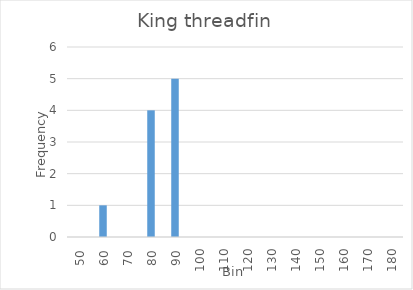
| Category | Frequency |
|---|---|
| 50.0 | 0 |
| 60.0 | 1 |
| 70.0 | 0 |
| 80.0 | 4 |
| 90.0 | 5 |
| 100.0 | 0 |
| 110.0 | 0 |
| 120.0 | 0 |
| 130.0 | 0 |
| 140.0 | 0 |
| 150.0 | 0 |
| 160.0 | 0 |
| 170.0 | 0 |
| 180.0 | 0 |